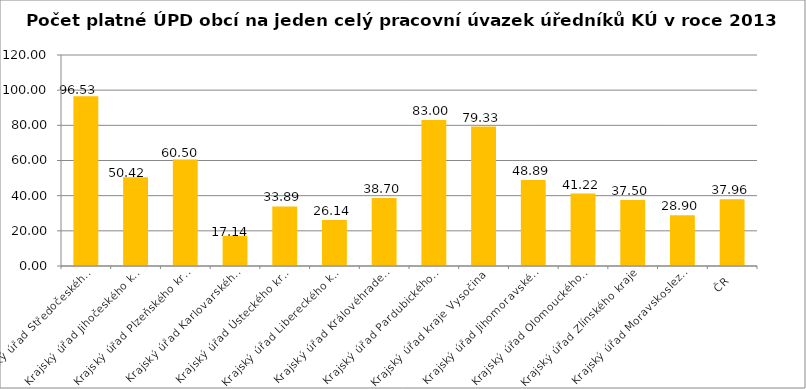
| Category | Počet platné ÚPD obcí na jeden celý pracovní úvazek úředníků KÚ |
|---|---|
| Krajský úřad Středočeského kraje | 96.53 |
| Krajský úřad Jihočeského kraje | 50.42 |
| Krajský úřad Plzeňského kraje | 60.5 |
| Krajský úřad Karlovarského kraje | 17.14 |
| Krajský úřad Ústeckého kraje | 33.89 |
| Krajský úřad Libereckého kraje | 26.14 |
| Krajský úřad Královéhradeckého kraje | 38.7 |
| Krajský úřad Pardubického kraje | 83 |
| Krajský úřad kraje Vysočina | 79.33 |
| Krajský úřad Jihomoravského kraje | 48.89 |
| Krajský úřad Olomouckého kraje | 41.22 |
| Krajský úřad Zlínského kraje | 37.5 |
| Krajský úřad Moravskoslezského kraje | 28.9 |
| ČR | 37.963 |